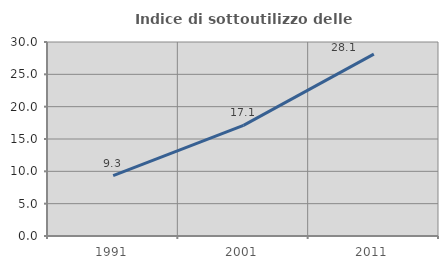
| Category | Indice di sottoutilizzo delle abitazioni  |
|---|---|
| 1991.0 | 9.35 |
| 2001.0 | 17.117 |
| 2011.0 | 28.125 |